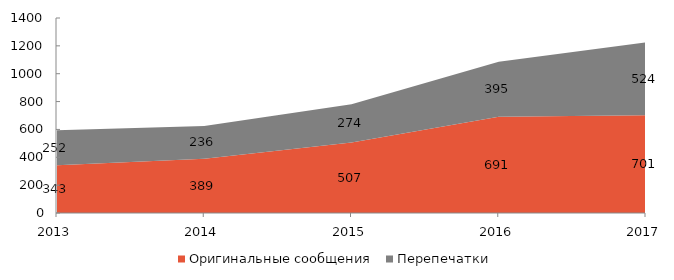
| Category | Оригинальные сообщения | Перепечатки |
|---|---|---|
| 2013 | 343 | 252 |
| 2014 | 389 | 236 |
| 2015 | 507 | 274 |
| 2016 | 691 | 395 |
| 2017 | 701 | 524 |